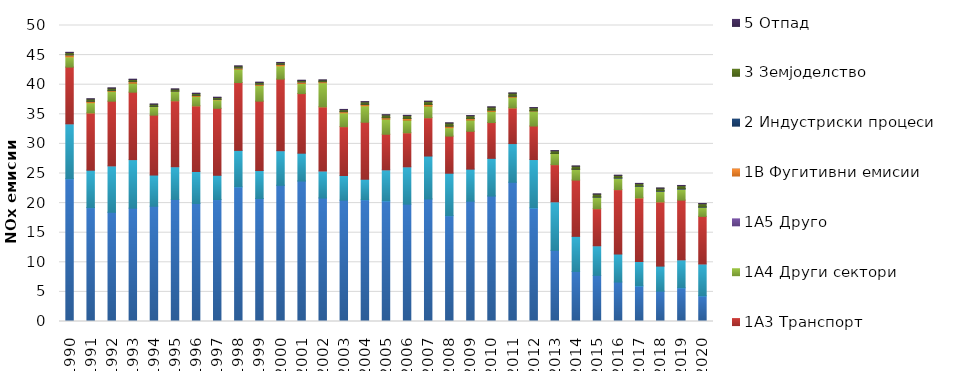
| Category | 1A1 | 1A2 | 1A3 | 1A4 | 1A5 | 1B | 2 | 3 | 5 |
|---|---|---|---|---|---|---|---|---|---|
| 1990.0 | 24.116 | 9.269 | 9.587 | 1.728 | 0 | 0.324 | 0.048 | 0.347 | 0.053 |
| 1991.0 | 19.236 | 6.322 | 9.672 | 1.724 | 0 | 0.25 | 0.03 | 0.34 | 0.053 |
| 1992.0 | 18.449 | 7.835 | 10.93 | 1.679 | 0 | 0.147 | 0.04 | 0.33 | 0.053 |
| 1993.0 | 19.148 | 8.196 | 11.389 | 1.517 | 0 | 0.264 | 0.047 | 0.317 | 0.053 |
| 1994.0 | 19.468 | 5.269 | 10.117 | 1.453 | 0 | 0.037 | 0.038 | 0.31 | 0.053 |
| 1995.0 | 20.629 | 5.515 | 11.138 | 1.613 | 0 | 0.031 | 0.029 | 0.285 | 0.052 |
| 1996.0 | 19.931 | 5.406 | 11.09 | 1.602 | 0 | 0.181 | 0.025 | 0.279 | 0.052 |
| 1997.0 | 20.594 | 4.103 | 11.314 | 1.441 | 0 | 0.098 | 0.027 | 0.261 | 0.051 |
| 1998.0 | 22.738 | 6.167 | 11.46 | 2.262 | 0 | 0.196 | 0.042 | 0.263 | 0.05 |
| 1999.0 | 20.768 | 4.734 | 11.72 | 2.663 | 0 | 0.198 | 0.052 | 0.245 | 0.05 |
| 2000.0 | 23.001 | 5.85 | 12.095 | 2.236 | 0 | 0.269 | 0.034 | 0.231 | 0.048 |
| 2001.0 | 23.72 | 4.708 | 10.074 | 1.697 | 0 | 0.263 | 0.047 | 0.201 | 0.049 |
| 2002.0 | 20.856 | 4.568 | 10.828 | 4.089 | 0 | 0.168 | 0.037 | 0.219 | 0.046 |
| 2003.0 | 20.488 | 4.177 | 8.251 | 2.327 | 0 | 0.204 | 0.046 | 0.287 | 0.046 |
| 2004.0 | 20.564 | 3.468 | 9.626 | 2.776 | 0 | 0.254 | 0.028 | 0.384 | 0.045 |
| 2005.0 | 20.366 | 5.248 | 6.011 | 2.558 | 0 | 0.246 | 0.005 | 0.458 | 0.044 |
| 2006.0 | 19.824 | 6.302 | 5.752 | 2.134 | 0 | 0.277 | 0.003 | 0.49 | 0.043 |
| 2007.0 | 20.691 | 7.259 | 6.472 | 1.96 | 0 | 0.273 | 0.002 | 0.516 | 0.043 |
| 2008.0 | 17.87 | 7.175 | 6.268 | 1.426 | 0 | 0.276 | 0.008 | 0.495 | 0.042 |
| 2009.0 | 20.321 | 5.418 | 6.39 | 1.896 | 0 | 0.253 | 0.009 | 0.463 | 0.042 |
| 2010.0 | 21.191 | 6.369 | 6.046 | 1.88 | 0 | 0.221 | 0.019 | 0.49 | 0.041 |
| 2011.0 | 23.518 | 6.536 | 6.022 | 1.808 | 0 | 0.183 | 0.018 | 0.481 | 0.042 |
| 2012.0 | 19.178 | 8.18 | 5.658 | 2.521 | 0 | 0.067 | 0.006 | 0.491 | 0.042 |
| 2013.0 | 12.012 | 8.202 | 6.28 | 1.87 | 0 | 0.016 | 0.011 | 0.436 | 0.042 |
| 2014.0 | 8.456 | 5.926 | 9.503 | 1.846 | 0 | 0.002 | 0.02 | 0.478 | 0.042 |
| 2015.0 | 7.787 | 5.002 | 6.262 | 1.948 | 0.022 | 0 | 0.016 | 0.472 | 0.043 |
| 2016.0 | 6.665 | 4.734 | 10.876 | 1.941 | 0.029 | 0 | 0.034 | 0.394 | 0.043 |
| 2017.0 | 6.001 | 4.138 | 10.735 | 1.948 | 0.025 | 0 | 0.047 | 0.394 | 0.044 |
| 2018.0 | 5.12 | 4.236 | 10.845 | 1.815 | 0.024 | 0 | 0.056 | 0.409 | 0.043 |
| 2019.0 | 5.684 | 4.729 | 10.093 | 1.869 | 0.025 | 0 | 0.046 | 0.492 | 0.043 |
| 2020.0 | 4.331 | 5.384 | 8.039 | 1.559 | 0.02 | 0 | 0.036 | 0.526 | 0.043 |